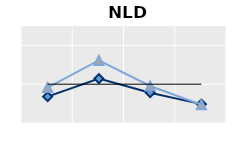
| Category | Né à l'étranger | Né dans le pays | Series 1 |
|---|---|---|---|
| 15-24 | 0.68 | 0.914 | 1 |
| 25-54 | 1.144 | 1.613 | 1 |
| 55-64 | 0.781 | 0.954 | 1 |
| 65+ | 0.486 | 0.472 | 1 |